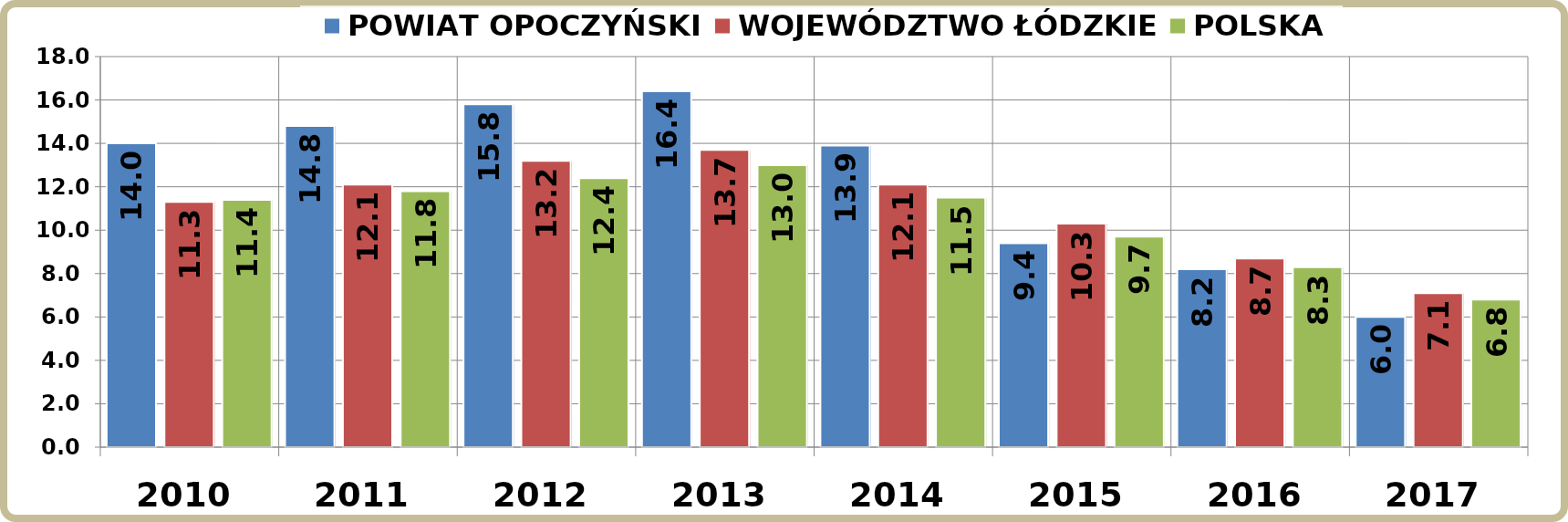
| Category | POWIAT OPOCZYŃSKI | WOJEWÓDZTWO ŁÓDZKIE | POLSKA |
|---|---|---|---|
| 2010.0 | 14 | 11.3 | 11.4 |
| 2011.0 | 14.8 | 12.1 | 11.8 |
| 2012.0 | 15.8 | 13.2 | 12.4 |
| 2013.0 | 16.4 | 13.7 | 13 |
| 2014.0 | 13.9 | 12.1 | 11.5 |
| 2015.0 | 9.4 | 10.3 | 9.7 |
| 2016.0 | 8.2 | 8.7 | 8.3 |
| 2017.0 | 6 | 7.1 | 6.8 |